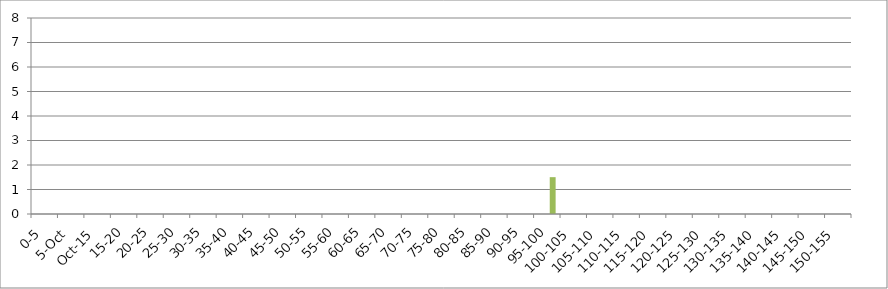
| Category | 119875 | 146067 | 241240 |
|---|---|---|---|
| 0-5 | 0 | 0 | 0 |
| 5-Oct | 0 | 0 | 0 |
| Oct-15 | 0 | 0 | 0 |
| 15-20 | 0 | 0 | 0 |
| 20-25 | 0 | 0 | 0 |
| 25-30 | 0 | 0 | 0 |
| 30-35 | 0 | 0 | 0 |
| 35-40 | 0 | 0 | 0 |
| 40-45 | 0 | 0 | 0 |
| 45-50 | 0 | 0 | 0 |
| 50-55 | 0 | 0 | 0 |
| 55-60 | 0 | 0 | 0 |
| 60-65 | 0 | 0 | 0 |
| 65-70 | 0 | 0 | 0 |
| 70-75 | 0 | 0 | 0 |
| 75-80 | 0 | 0 | 0 |
| 80-85 | 0 | 0 | 0 |
| 85-90 | 0 | 0 | 0 |
| 90-95 | 0 | 0 | 0 |
| 95-100 | 0 | 0 | 1.504 |
| 100-105 | 0 | 0 | 0 |
| 105-110 | 0 | 0 | 0 |
| 110-115 | 0 | 0 | 0 |
| 115-120 | 0 | 0 | 0 |
| 120-125 | 0 | 0 | 0 |
| 125-130 | 0 | 0 | 0 |
| 130-135 | 0 | 0 | 0 |
| 135-140 | 0 | 0 | 0 |
| 140-145 | 0 | 0 | 0 |
| 145-150 | 0 | 0 | 0 |
| 150-155 | 0 | 0 | 0 |